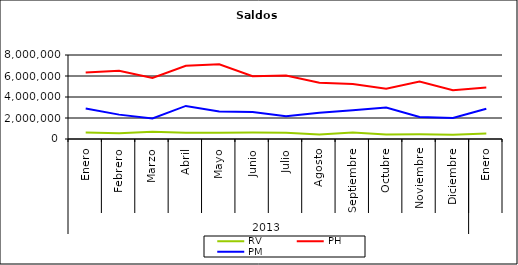
| Category | RV | PH | PM |
|---|---|---|---|
| 0 | 625726.624 | 6338490.057 | 2894951.851 |
| 1 | 552164.14 | 6505711.807 | 2320902.81 |
| 2 | 684317.675 | 5822855.149 | 1948127.804 |
| 3 | 601474.166 | 6976391.987 | 3151453.143 |
| 4 | 590050.657 | 7107878.906 | 2620515.735 |
| 5 | 624993.58 | 5975534.656 | 2574055.31 |
| 6 | 600696.535 | 6050025.472 | 2173848.831 |
| 7 | 419012.816 | 5367684.924 | 2503871.717 |
| 8 | 611730.758 | 5247250.768 | 2727549.288 |
| 9 | 419155.215 | 4784420.625 | 2990459.774 |
| 10 | 447319.577 | 5481772.72 | 2092491.866 |
| 11 | 408611.698 | 4646492.747 | 1999878.157 |
| 12 | 527889.485 | 4912075.273 | 2877652.76 |